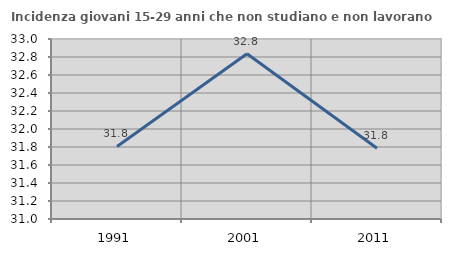
| Category | Incidenza giovani 15-29 anni che non studiano e non lavorano  |
|---|---|
| 1991.0 | 31.806 |
| 2001.0 | 32.836 |
| 2011.0 | 31.786 |